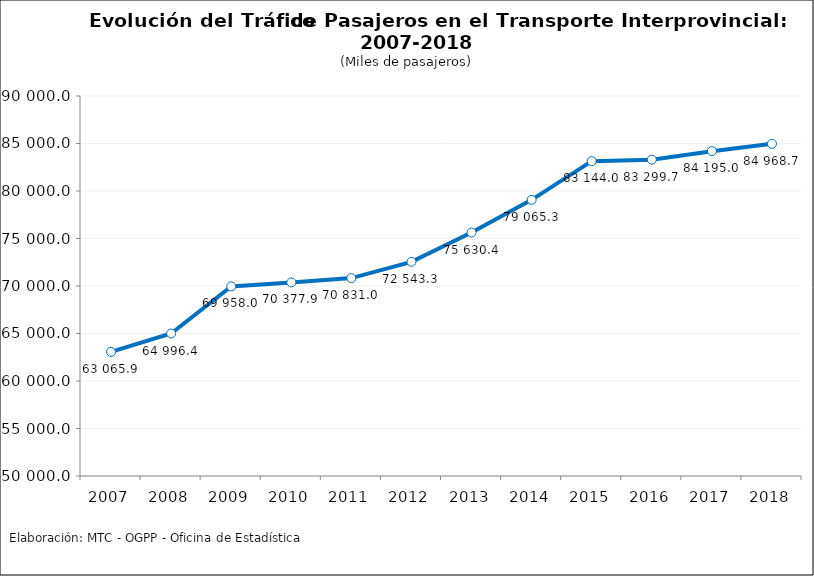
| Category | Series 0 |
|---|---|
| 2007.0 | 63065.931 |
| 2008.0 | 64996.428 |
| 2009.0 | 69957.988 |
| 2010.0 | 70377.943 |
| 2011.0 | 70831.018 |
| 2012.0 | 72543.294 |
| 2013.0 | 75630.386 |
| 2014.0 | 79065.315 |
| 2015.0 | 83144 |
| 2016.0 | 83299.65 |
| 2017.0 | 84195.011 |
| 2018.0 | 84968.73 |